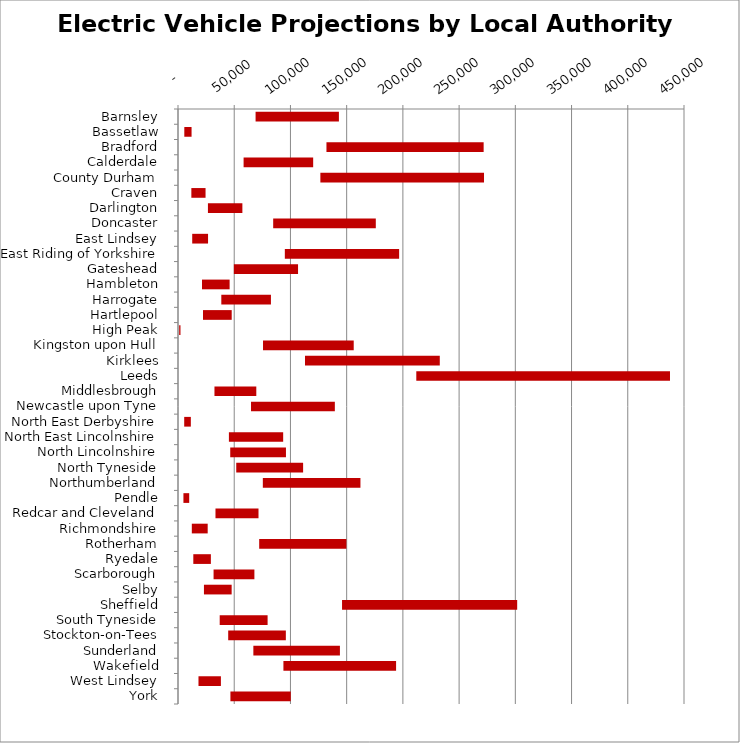
| Category | MIN | MAX |
|---|---|---|
| Barnsley | 68999 | 74094 |
| Bassetlaw | 5605 | 6456 |
| Bradford | 132025 | 139793 |
| Calderdale | 58340 | 61874 |
| County Durham | 126613 | 145534 |
| Craven | 11874 | 12624 |
| Darlington | 26620 | 30631 |
| Doncaster | 84652 | 91258 |
| East Lindsey | 12639 | 14089 |
| East Riding of Yorkshire | 95008 | 101646 |
| Gateshead | 49689 | 57072 |
| Hambleton | 21338 | 24565 |
| Harrogate | 38519 | 44134 |
| Hartlepool | 22233 | 25527 |
| High Peak | 1050 | 1143 |
| Kingston upon Hull | 75607 | 80666 |
| Kirklees | 112944 | 119866 |
| Leeds | 211927 | 225616 |
| Middlesbrough | 32426 | 37206 |
| Newcastle upon Tyne | 64936 | 74552 |
| North East Derbyshire | 5514 | 5898 |
| North East Lincolnshire | 45270 | 48263 |
| North Lincolnshire | 46460 | 49546 |
| North Tyneside | 51797 | 59471 |
| Northumberland | 75442 | 86805 |
| Pendle | 4826 | 5141 |
| Redcar and Cleveland | 33335 | 38262 |
| Richmondshire | 12282 | 14122 |
| Rotherham | 72205 | 77557 |
| Ryedale | 13614 | 15621 |
| Scarborough | 31634 | 36305 |
| Selby | 23071 | 24640 |
| Sheffield | 145889 | 155757 |
| South Tyneside | 37090 | 42595 |
| Stockton-on-Tees | 44643 | 51267 |
| Sunderland | 67019 | 76977 |
| Wakefield | 93750 | 100197 |
| West Lindsey | 18217 | 19939 |
| York | 46619 | 53685 |